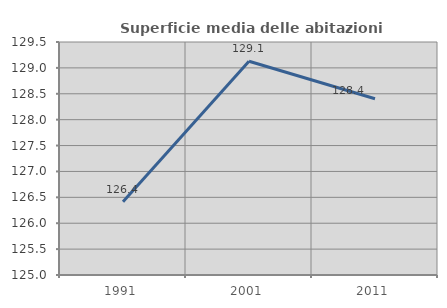
| Category | Superficie media delle abitazioni occupate |
|---|---|
| 1991.0 | 126.415 |
| 2001.0 | 129.129 |
| 2011.0 | 128.405 |